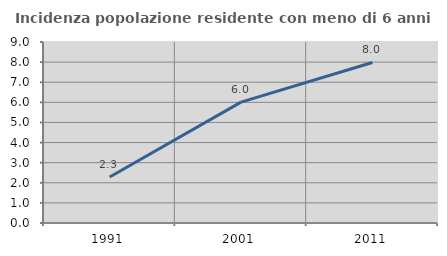
| Category | Incidenza popolazione residente con meno di 6 anni |
|---|---|
| 1991.0 | 2.29 |
| 2001.0 | 6.009 |
| 2011.0 | 7.983 |